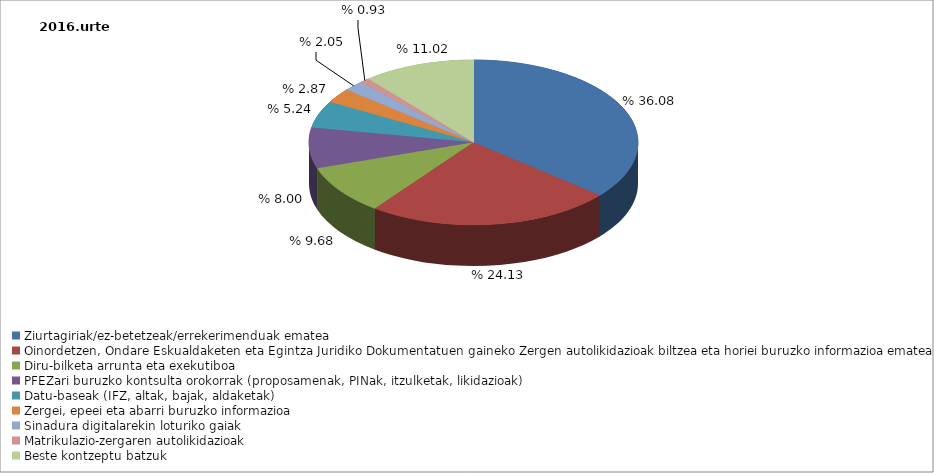
| Category | Series 0 |
|---|---|
| Ziurtagiriak/ez-betetzeak/errekerimenduak ematea | 0.361 |
| Oinordetzen, Ondare Eskualdaketen eta Egintza Juridiko Dokumentatuen gaineko Zergen autolikidazioak biltzea eta horiei buruzko informazioa ematea | 0.241 |
| Diru-bilketa arrunta eta exekutiboa | 0.097 |
| PFEZari buruzko kontsulta orokorrak (proposamenak, PINak, itzulketak, likidazioak) | 0.08 |
| Datu-baseak (IFZ, altak, bajak, aldaketak) | 0.052 |
| Zergei, epeei eta abarri buruzko informazioa | 0.029 |
| Sinadura digitalarekin loturiko gaiak | 0.02 |
| Matrikulazio-zergaren autolikidazioak | 0.009 |
| Beste kontzeptu batzuk | 0.11 |